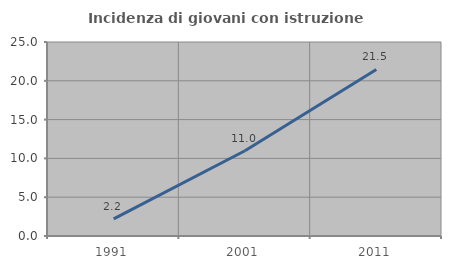
| Category | Incidenza di giovani con istruzione universitaria |
|---|---|
| 1991.0 | 2.212 |
| 2001.0 | 10.985 |
| 2011.0 | 21.463 |